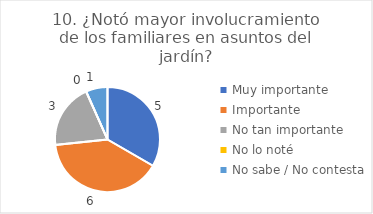
| Category | 10. ¿Notó mayor involucramiento de los familiares en asuntos del jardín? |
|---|---|
| Muy importante  | 0.333 |
| Importante  | 0.4 |
| No tan importante  | 0.2 |
| No lo noté  | 0 |
| No sabe / No contesta | 0.067 |